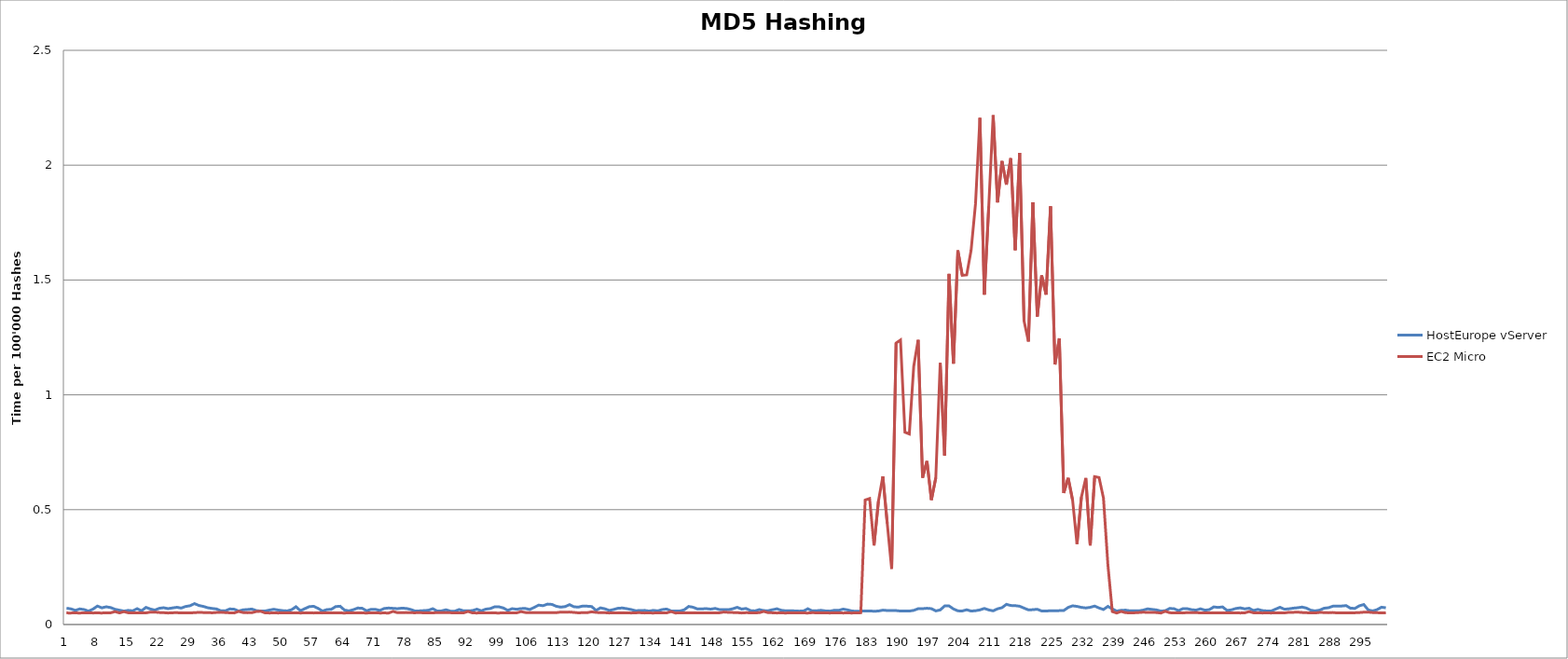
| Category | HostEurope vServer | EC2 Micro |
|---|---|---|
| 0 | 0.071 | 0.05 |
| 1 | 0.068 | 0.05 |
| 2 | 0.062 | 0.05 |
| 3 | 0.068 | 0.05 |
| 4 | 0.065 | 0.051 |
| 5 | 0.058 | 0.051 |
| 6 | 0.067 | 0.05 |
| 7 | 0.08 | 0.051 |
| 8 | 0.073 | 0.05 |
| 9 | 0.077 | 0.051 |
| 10 | 0.074 | 0.051 |
| 11 | 0.066 | 0.056 |
| 12 | 0.062 | 0.05 |
| 13 | 0.058 | 0.056 |
| 14 | 0.062 | 0.051 |
| 15 | 0.06 | 0.051 |
| 16 | 0.069 | 0.05 |
| 17 | 0.06 | 0.051 |
| 18 | 0.075 | 0.051 |
| 19 | 0.067 | 0.054 |
| 20 | 0.063 | 0.054 |
| 21 | 0.07 | 0.052 |
| 22 | 0.073 | 0.052 |
| 23 | 0.069 | 0.05 |
| 24 | 0.072 | 0.051 |
| 25 | 0.075 | 0.052 |
| 26 | 0.072 | 0.05 |
| 27 | 0.079 | 0.051 |
| 28 | 0.082 | 0.051 |
| 29 | 0.091 | 0.052 |
| 30 | 0.083 | 0.053 |
| 31 | 0.079 | 0.052 |
| 32 | 0.073 | 0.052 |
| 33 | 0.07 | 0.051 |
| 34 | 0.068 | 0.052 |
| 35 | 0.059 | 0.053 |
| 36 | 0.06 | 0.052 |
| 37 | 0.068 | 0.051 |
| 38 | 0.067 | 0.05 |
| 39 | 0.059 | 0.057 |
| 40 | 0.064 | 0.052 |
| 41 | 0.065 | 0.051 |
| 42 | 0.067 | 0.052 |
| 43 | 0.061 | 0.057 |
| 44 | 0.058 | 0.058 |
| 45 | 0.059 | 0.051 |
| 46 | 0.063 | 0.05 |
| 47 | 0.066 | 0.05 |
| 48 | 0.063 | 0.05 |
| 49 | 0.06 | 0.051 |
| 50 | 0.059 | 0.051 |
| 51 | 0.064 | 0.05 |
| 52 | 0.078 | 0.051 |
| 53 | 0.06 | 0.05 |
| 54 | 0.069 | 0.051 |
| 55 | 0.078 | 0.051 |
| 56 | 0.08 | 0.05 |
| 57 | 0.07 | 0.051 |
| 58 | 0.059 | 0.05 |
| 59 | 0.065 | 0.051 |
| 60 | 0.066 | 0.051 |
| 61 | 0.078 | 0.05 |
| 62 | 0.08 | 0.051 |
| 63 | 0.063 | 0.05 |
| 64 | 0.059 | 0.051 |
| 65 | 0.065 | 0.051 |
| 66 | 0.072 | 0.05 |
| 67 | 0.071 | 0.051 |
| 68 | 0.06 | 0.05 |
| 69 | 0.066 | 0.051 |
| 70 | 0.066 | 0.051 |
| 71 | 0.061 | 0.05 |
| 72 | 0.07 | 0.05 |
| 73 | 0.072 | 0.05 |
| 74 | 0.07 | 0.057 |
| 75 | 0.069 | 0.051 |
| 76 | 0.071 | 0.051 |
| 77 | 0.07 | 0.052 |
| 78 | 0.066 | 0.051 |
| 79 | 0.059 | 0.051 |
| 80 | 0.059 | 0.052 |
| 81 | 0.061 | 0.05 |
| 82 | 0.062 | 0.051 |
| 83 | 0.069 | 0.05 |
| 84 | 0.058 | 0.052 |
| 85 | 0.059 | 0.051 |
| 86 | 0.064 | 0.051 |
| 87 | 0.058 | 0.051 |
| 88 | 0.058 | 0.05 |
| 89 | 0.065 | 0.051 |
| 90 | 0.059 | 0.051 |
| 91 | 0.059 | 0.057 |
| 92 | 0.061 | 0.05 |
| 93 | 0.067 | 0.05 |
| 94 | 0.06 | 0.051 |
| 95 | 0.067 | 0.051 |
| 96 | 0.069 | 0.05 |
| 97 | 0.077 | 0.05 |
| 98 | 0.077 | 0.05 |
| 99 | 0.072 | 0.051 |
| 100 | 0.062 | 0.051 |
| 101 | 0.069 | 0.05 |
| 102 | 0.066 | 0.051 |
| 103 | 0.069 | 0.056 |
| 104 | 0.07 | 0.052 |
| 105 | 0.065 | 0.052 |
| 106 | 0.075 | 0.052 |
| 107 | 0.084 | 0.052 |
| 108 | 0.082 | 0.051 |
| 109 | 0.089 | 0.052 |
| 110 | 0.088 | 0.051 |
| 111 | 0.079 | 0.052 |
| 112 | 0.076 | 0.054 |
| 113 | 0.078 | 0.054 |
| 114 | 0.087 | 0.054 |
| 115 | 0.077 | 0.053 |
| 116 | 0.076 | 0.051 |
| 117 | 0.081 | 0.052 |
| 118 | 0.08 | 0.052 |
| 119 | 0.078 | 0.055 |
| 120 | 0.061 | 0.053 |
| 121 | 0.073 | 0.051 |
| 122 | 0.068 | 0.051 |
| 123 | 0.061 | 0.05 |
| 124 | 0.065 | 0.051 |
| 125 | 0.071 | 0.051 |
| 126 | 0.072 | 0.05 |
| 127 | 0.069 | 0.051 |
| 128 | 0.065 | 0.05 |
| 129 | 0.06 | 0.051 |
| 130 | 0.061 | 0.051 |
| 131 | 0.061 | 0.05 |
| 132 | 0.058 | 0.051 |
| 133 | 0.062 | 0.05 |
| 134 | 0.059 | 0.051 |
| 135 | 0.065 | 0.051 |
| 136 | 0.067 | 0.05 |
| 137 | 0.059 | 0.056 |
| 138 | 0.059 | 0.05 |
| 139 | 0.059 | 0.051 |
| 140 | 0.064 | 0.051 |
| 141 | 0.079 | 0.05 |
| 142 | 0.075 | 0.051 |
| 143 | 0.067 | 0.05 |
| 144 | 0.068 | 0.051 |
| 145 | 0.069 | 0.051 |
| 146 | 0.067 | 0.05 |
| 147 | 0.07 | 0.051 |
| 148 | 0.065 | 0.051 |
| 149 | 0.065 | 0.054 |
| 150 | 0.065 | 0.053 |
| 151 | 0.069 | 0.052 |
| 152 | 0.075 | 0.052 |
| 153 | 0.067 | 0.05 |
| 154 | 0.07 | 0.051 |
| 155 | 0.061 | 0.051 |
| 156 | 0.059 | 0.051 |
| 157 | 0.065 | 0.051 |
| 158 | 0.06 | 0.057 |
| 159 | 0.06 | 0.052 |
| 160 | 0.064 | 0.051 |
| 161 | 0.068 | 0.05 |
| 162 | 0.062 | 0.05 |
| 163 | 0.06 | 0.05 |
| 164 | 0.06 | 0.051 |
| 165 | 0.059 | 0.051 |
| 166 | 0.058 | 0.05 |
| 167 | 0.059 | 0.05 |
| 168 | 0.069 | 0.05 |
| 169 | 0.059 | 0.052 |
| 170 | 0.06 | 0.051 |
| 171 | 0.062 | 0.05 |
| 172 | 0.059 | 0.051 |
| 173 | 0.058 | 0.05 |
| 174 | 0.062 | 0.051 |
| 175 | 0.062 | 0.051 |
| 176 | 0.067 | 0.05 |
| 177 | 0.064 | 0.05 |
| 178 | 0.059 | 0.05 |
| 179 | 0.058 | 0.051 |
| 180 | 0.058 | 0.051 |
| 181 | 0.059 | 0.542 |
| 182 | 0.059 | 0.548 |
| 183 | 0.058 | 0.344 |
| 184 | 0.059 | 0.537 |
| 185 | 0.063 | 0.645 |
| 186 | 0.061 | 0.44 |
| 187 | 0.061 | 0.242 |
| 188 | 0.061 | 1.226 |
| 189 | 0.059 | 1.239 |
| 190 | 0.058 | 0.837 |
| 191 | 0.059 | 0.83 |
| 192 | 0.062 | 1.124 |
| 193 | 0.069 | 1.239 |
| 194 | 0.069 | 0.639 |
| 195 | 0.071 | 0.712 |
| 196 | 0.069 | 0.542 |
| 197 | 0.059 | 0.639 |
| 198 | 0.063 | 1.139 |
| 199 | 0.081 | 0.736 |
| 200 | 0.081 | 1.527 |
| 201 | 0.068 | 1.136 |
| 202 | 0.059 | 1.629 |
| 203 | 0.059 | 1.52 |
| 204 | 0.064 | 1.522 |
| 205 | 0.059 | 1.629 |
| 206 | 0.06 | 1.832 |
| 207 | 0.064 | 2.206 |
| 208 | 0.07 | 1.436 |
| 209 | 0.063 | 1.82 |
| 210 | 0.06 | 2.218 |
| 211 | 0.068 | 1.838 |
| 212 | 0.073 | 2.018 |
| 213 | 0.088 | 1.915 |
| 214 | 0.083 | 2.03 |
| 215 | 0.082 | 1.63 |
| 216 | 0.08 | 2.054 |
| 217 | 0.071 | 1.322 |
| 218 | 0.064 | 1.232 |
| 219 | 0.065 | 1.839 |
| 220 | 0.066 | 1.341 |
| 221 | 0.059 | 1.52 |
| 222 | 0.059 | 1.436 |
| 223 | 0.06 | 1.821 |
| 224 | 0.06 | 1.132 |
| 225 | 0.06 | 1.246 |
| 226 | 0.061 | 0.572 |
| 227 | 0.074 | 0.638 |
| 228 | 0.081 | 0.542 |
| 229 | 0.079 | 0.351 |
| 230 | 0.075 | 0.555 |
| 231 | 0.072 | 0.638 |
| 232 | 0.075 | 0.344 |
| 233 | 0.08 | 0.644 |
| 234 | 0.072 | 0.64 |
| 235 | 0.065 | 0.55 |
| 236 | 0.079 | 0.26 |
| 237 | 0.068 | 0.057 |
| 238 | 0.059 | 0.05 |
| 239 | 0.062 | 0.057 |
| 240 | 0.063 | 0.051 |
| 241 | 0.06 | 0.051 |
| 242 | 0.06 | 0.051 |
| 243 | 0.06 | 0.052 |
| 244 | 0.063 | 0.054 |
| 245 | 0.068 | 0.053 |
| 246 | 0.066 | 0.053 |
| 247 | 0.063 | 0.052 |
| 248 | 0.058 | 0.05 |
| 249 | 0.06 | 0.058 |
| 250 | 0.07 | 0.051 |
| 251 | 0.069 | 0.05 |
| 252 | 0.061 | 0.051 |
| 253 | 0.069 | 0.05 |
| 254 | 0.069 | 0.052 |
| 255 | 0.064 | 0.052 |
| 256 | 0.063 | 0.052 |
| 257 | 0.068 | 0.051 |
| 258 | 0.062 | 0.05 |
| 259 | 0.065 | 0.051 |
| 260 | 0.077 | 0.051 |
| 261 | 0.074 | 0.051 |
| 262 | 0.077 | 0.051 |
| 263 | 0.061 | 0.05 |
| 264 | 0.064 | 0.051 |
| 265 | 0.07 | 0.051 |
| 266 | 0.073 | 0.05 |
| 267 | 0.068 | 0.051 |
| 268 | 0.071 | 0.056 |
| 269 | 0.061 | 0.051 |
| 270 | 0.066 | 0.051 |
| 271 | 0.061 | 0.05 |
| 272 | 0.059 | 0.051 |
| 273 | 0.059 | 0.05 |
| 274 | 0.067 | 0.051 |
| 275 | 0.075 | 0.051 |
| 276 | 0.067 | 0.05 |
| 277 | 0.068 | 0.053 |
| 278 | 0.071 | 0.053 |
| 279 | 0.073 | 0.054 |
| 280 | 0.076 | 0.052 |
| 281 | 0.072 | 0.051 |
| 282 | 0.062 | 0.051 |
| 283 | 0.059 | 0.05 |
| 284 | 0.063 | 0.053 |
| 285 | 0.071 | 0.052 |
| 286 | 0.073 | 0.051 |
| 287 | 0.08 | 0.052 |
| 288 | 0.08 | 0.05 |
| 289 | 0.081 | 0.051 |
| 290 | 0.082 | 0.051 |
| 291 | 0.071 | 0.05 |
| 292 | 0.07 | 0.051 |
| 293 | 0.081 | 0.052 |
| 294 | 0.087 | 0.054 |
| 295 | 0.063 | 0.054 |
| 296 | 0.059 | 0.052 |
| 297 | 0.065 | 0.051 |
| 298 | 0.075 | 0.05 |
| 299 | 0.073 | 0.051 |